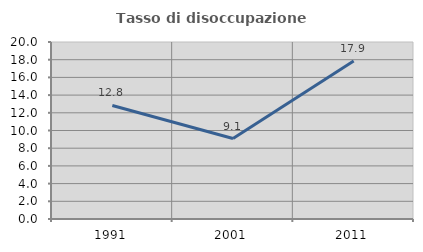
| Category | Tasso di disoccupazione giovanile  |
|---|---|
| 1991.0 | 12.827 |
| 2001.0 | 9.091 |
| 2011.0 | 17.857 |